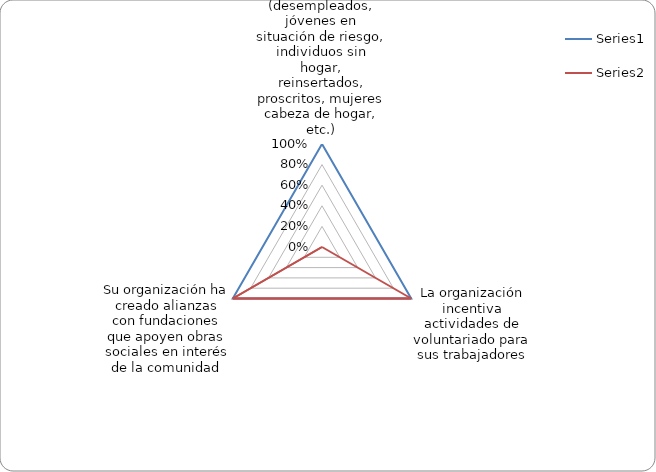
| Category | Series 0 | Series 1 |
|---|---|---|
| Su organización crea opciones de trabajo para población en situación de vulnerabilidad (desempleados, jóvenes en situación de riesgo, individuos sin hogar, reinsertados, proscritos, mujeres cabeza de hogar, etc.) | 1 | 0 |
| La organización incentiva actividades de voluntariado para sus trabajadores | 1 | 1 |
| Su organización ha creado alianzas con fundaciones que apoyen obras sociales en interés de la comunidad | 1 | 1 |